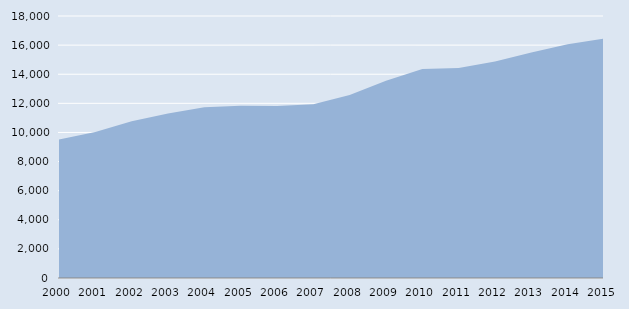
| Category | Series 0 |
|---|---|
| 2000.0 | 9509 |
| 2001.0 | 10030 |
| 2002.0 | 10762 |
| 2003.0 | 11300 |
| 2004.0 | 11729 |
| 2005.0 | 11833 |
| 2006.0 | 11823 |
| 2007.0 | 11940 |
| 2008.0 | 12569 |
| 2009.0 | 13553 |
| 2010.0 | 14356 |
| 2011.0 | 14430 |
| 2012.0 | 14868 |
| 2013.0 | 15486 |
| 2014.0 | 16054 |
| 2015.0 | 16456 |